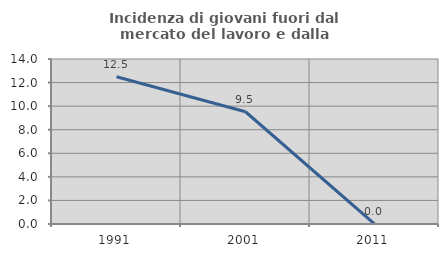
| Category | Incidenza di giovani fuori dal mercato del lavoro e dalla formazione  |
|---|---|
| 1991.0 | 12.5 |
| 2001.0 | 9.524 |
| 2011.0 | 0 |